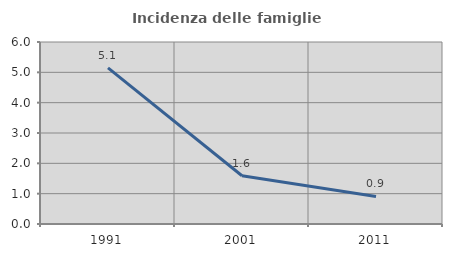
| Category | Incidenza delle famiglie numerose |
|---|---|
| 1991.0 | 5.147 |
| 2001.0 | 1.591 |
| 2011.0 | 0.91 |